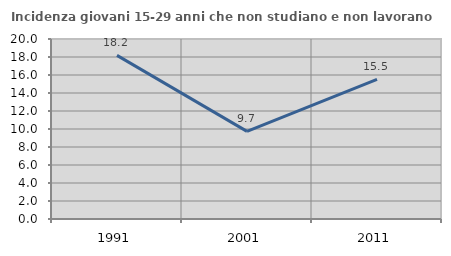
| Category | Incidenza giovani 15-29 anni che non studiano e non lavorano  |
|---|---|
| 1991.0 | 18.182 |
| 2001.0 | 9.735 |
| 2011.0 | 15.504 |